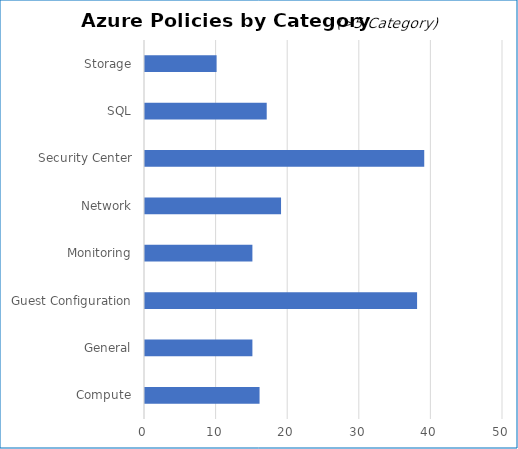
| Category | Policy |
|---|---|
| Compute | 16 |
| General | 15 |
| Guest Configuration | 38 |
| Monitoring | 15 |
| Network | 19 |
| Security Center | 39 |
| SQL | 17 |
| Storage | 10 |